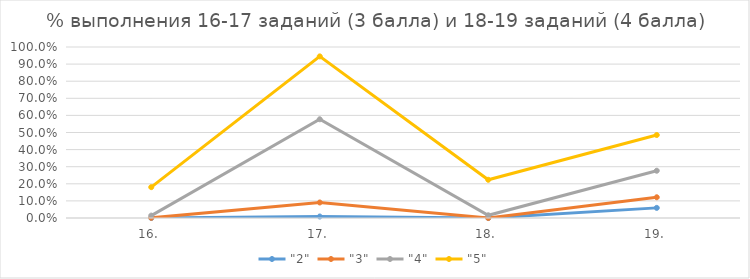
| Category | "2" | "3" | "4" | "5" |
|---|---|---|---|---|
| 16. | 0 | 0.001 | 0.014 | 0.18 |
| 17. | 0.009 | 0.091 | 0.577 | 0.945 |
| 18. | 0 | 0 | 0.016 | 0.224 |
| 19. | 0.059 | 0.121 | 0.276 | 0.485 |